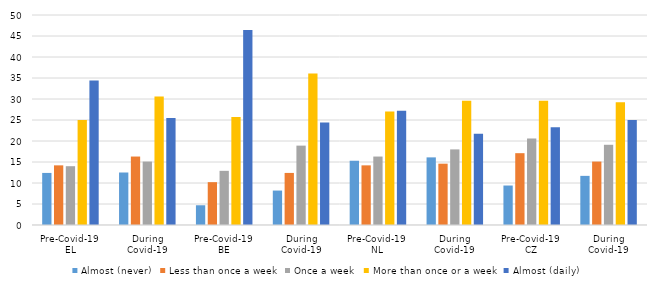
| Category | Almost (never) | Less than once a week | Once a week | More than once or a week | Almost (daily) |
|---|---|---|---|---|---|
| 0 | 12.4 | 14.2 | 14 | 25 | 34.4 |
| 1 | 12.5 | 16.3 | 15.1 | 30.6 | 25.5 |
| 2 | 4.7 | 10.2 | 12.9 | 25.7 | 46.4 |
| 3 | 8.2 | 12.4 | 18.9 | 36.1 | 24.4 |
| 4 | 15.3 | 14.2 | 16.3 | 27 | 27.2 |
| 5 | 16.1 | 14.6 | 18 | 29.6 | 21.7 |
| 6 | 9.4 | 17.1 | 20.6 | 29.6 | 23.3 |
| 7 | 11.7 | 15.1 | 19.1 | 29.2 | 25 |